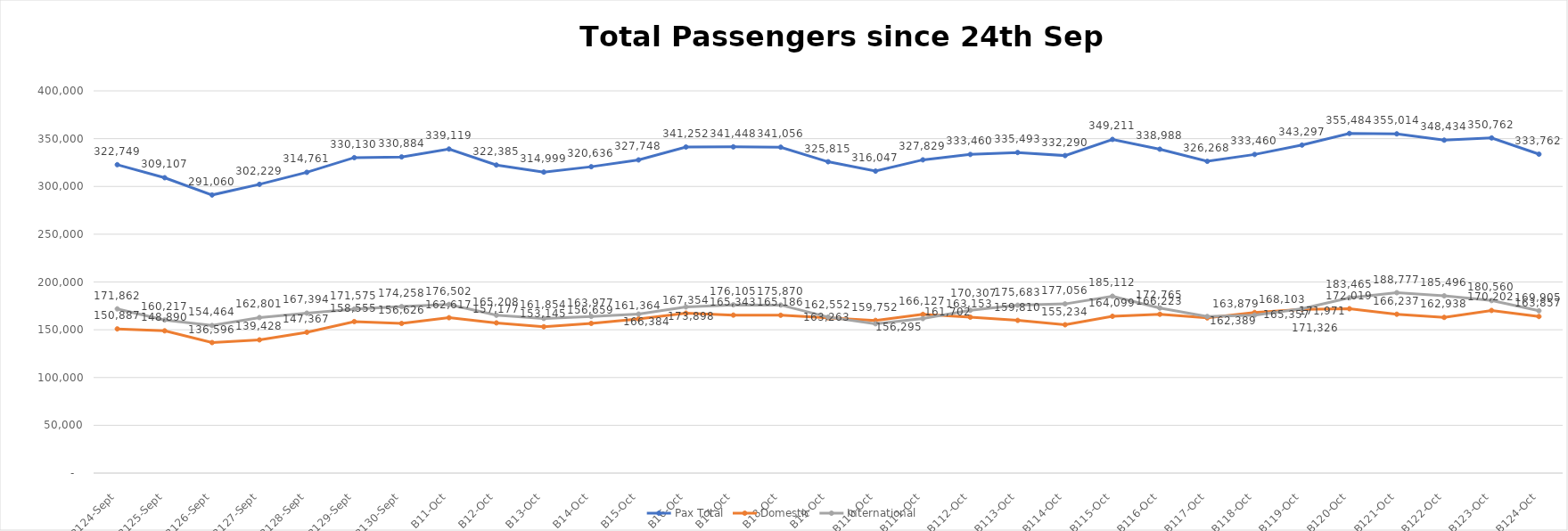
| Category | Pax Total | Domestic | International |
|---|---|---|---|
| 2023-09-24 | 322749 | 150887 | 171862 |
| 2023-09-25 | 309107 | 148890 | 160217 |
| 2023-09-26 | 291060 | 136596 | 154464 |
| 2023-09-27 | 302229 | 139428 | 162801 |
| 2023-09-28 | 314761 | 147367 | 167394 |
| 2023-09-29 | 330130 | 158555 | 171575 |
| 2023-09-30 | 330884 | 156626 | 174258 |
| 2023-10-01 | 339119 | 162617 | 176502 |
| 2023-10-02 | 322385 | 157177 | 165208 |
| 2023-10-03 | 314999 | 153145 | 161854 |
| 2023-10-04 | 320636 | 156659 | 163977 |
| 2023-10-05 | 327748 | 161364 | 166384 |
| 2023-10-06 | 341252 | 167354 | 173898 |
| 2023-10-07 | 341448 | 165343 | 176105 |
| 2023-10-08 | 341056 | 165186 | 175870 |
| 2023-10-09 | 325815 | 162552 | 163263 |
| 2023-10-10 | 316047 | 159752 | 156295 |
| 2023-10-11 | 327829 | 166127 | 161702 |
| 2023-10-12 | 333460 | 163153 | 170307 |
| 2023-10-13 | 335493 | 159810 | 175683 |
| 2023-10-14 | 332290 | 155234 | 177056 |
| 2023-10-15 | 349211 | 164099 | 185112 |
| 2023-10-16 | 338988 | 166223 | 172765 |
| 2023-10-17 | 326268 | 162389 | 163879 |
| 2023-10-18 | 333460 | 168103 | 165357 |
| 2023-10-19 | 343297 | 171326 | 171971 |
| 2023-10-20 | 355484 | 172019 | 183465 |
| 2023-10-21 | 355014 | 166237 | 188777 |
| 2023-10-22 | 348434 | 162938 | 185496 |
| 2023-10-23 | 350762 | 170202 | 180560 |
| 2023-10-24 | 333762 | 163857 | 169905 |